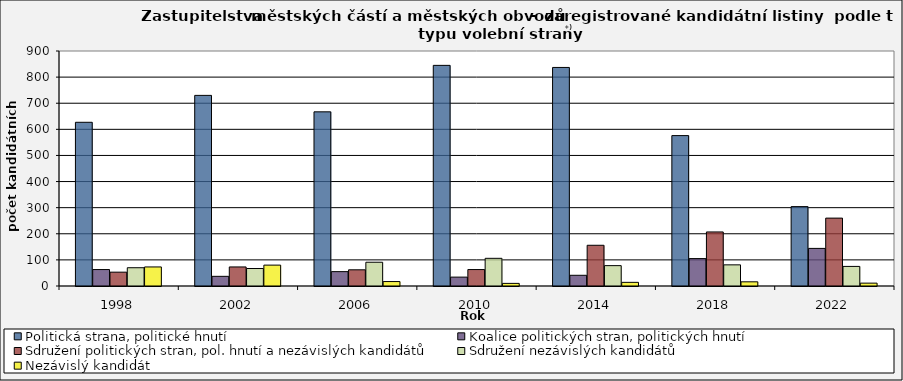
| Category | Politická strana, politické hnutí  | Koalice politických stran, politických hnutí | Sdružení politických stran, pol. hnutí a nezávislých kandidátů | Sdružení nezávislých kandidátů | Nezávislý kandidát |
|---|---|---|---|---|---|
| 1998.0 | 627 | 63 | 53 | 70 | 73 |
| 2002.0 | 730 | 37 | 73 | 67 | 80 |
| 2006.0 | 667 | 55 | 62 | 91 | 17 |
| 2010.0 | 845 | 34 | 63 | 106 | 10 |
| 2014.0 | 837 | 41 | 156 | 78 | 14 |
| 2018.0 | 576 | 105 | 207 | 81 | 16 |
| 2022.0 | 304 | 144 | 260 | 75 | 11 |